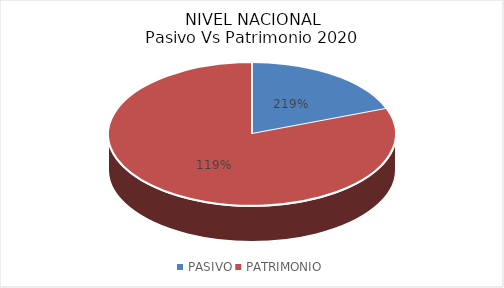
| Category | Series 0 |
|---|---|
| PASIVO | 1526706651553.98 |
| PATRIMONIO | -830581504118.24 |